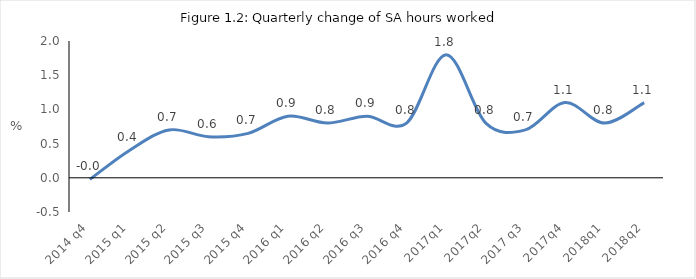
| Category | Series 0 |
|---|---|
| 2014 q4 | -0.023 |
| 2015 q1 | 0.4 |
| 2015 q2 | 0.7 |
| 2015 q3 | 0.6 |
| 2015 q4 | 0.65 |
| 2016 q1 | 0.9 |
| 2016 q2 | 0.8 |
| 2016 q3 | 0.9 |
| 2016 q4 | 0.8 |
| 2017q1 | 1.8 |
| 2017q2 | 0.8 |
| 2017 q3 | 0.7 |
| 2017q4 | 1.1 |
| 2018q1 | 0.8 |
| 2018q2 | 1.1 |